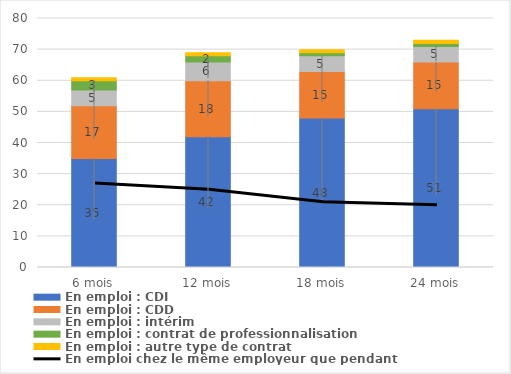
| Category | En emploi : CDI | En emploi : CDD | En emploi : intérim | En emploi : contrat de professionnalisation | En emploi : autre type de contrat |
|---|---|---|---|---|---|
| 6 mois | 35 | 17 | 5 | 3 | 1 |
| 12 mois | 42 | 18 | 6 | 2 | 1 |
| 18 mois | 48 | 15 | 5 | 1 | 1 |
| 24 mois | 51 | 15 | 5 | 1 | 1 |